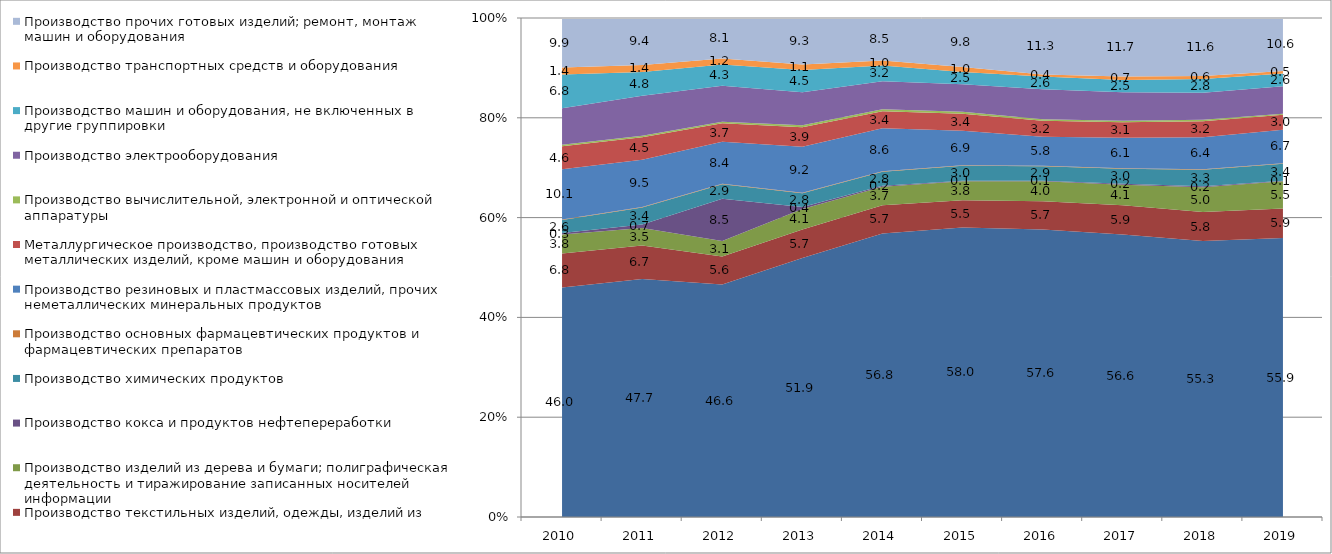
| Category | Производство продуктов питания, напитков и табачных изделий | Производство текстильных изделий, одежды, изделий из кожи и меха | Производство изделий из дерева и бумаги; полиграфическая деятельность и тиражирование записанных носителей информации | Производство кокса и продуктов нефтепереработки | Производство химических продуктов | Производство основных фармацевтических продуктов и фармацевтических препаратов | Производство резиновых и пластмассовых изделий, прочих неметаллических минеральных продуктов | Металлургическое производство, производство готовых металлических изделий, кроме машин и оборудования | Производство вычислительной, электронной и оптической аппаратуры | Производство электрооборудования | Производство машин и оборудования, не включенных в другие группировки | Производство транспортных средств и оборудования | Производство прочих готовых изделий; ремонт, монтаж машин и оборудования |
|---|---|---|---|---|---|---|---|---|---|---|---|---|---|
| 0 | 46 | 6.8 | 3.8 | 0.3 | 2.6 | 0.1 | 10.1 | 4.6 | 0.3 | 7.3 | 6.8 | 1.4 | 9.9 |
| 1 | 47.7 | 6.7 | 3.5 | 0.7 | 3.4 | 0.1 | 9.5 | 4.5 | 0.3 | 8 | 4.8 | 1.4 | 9.4 |
| 2 | 46.6 | 5.6 | 3.1 | 8.5 | 2.9 | 0.1 | 8.4 | 3.7 | 0.3 | 7.2 | 4.3 | 1.2 | 8.1 |
| 3 | 51.9 | 5.7 | 4.1 | 0.4 | 2.8 | 0.1 | 9.2 | 3.9 | 0.4 | 6.6 | 4.5 | 1.1 | 9.3 |
| 4 | 56.8 | 5.7 | 3.7 | 0.2 | 2.8 | 0.1 | 8.6 | 3.4 | 0.4 | 5.6 | 3.2 | 1 | 8.5 |
| 5 | 58 | 5.5 | 3.8 | 0.1 | 3 | 0.1 | 6.9 | 3.4 | 0.4 | 5.5 | 2.5 | 1 | 9.8 |
| 6 | 57.6 | 5.7 | 4 | 0.1 | 2.9 | 0.1 | 5.8 | 3.2 | 0.3 | 6 | 2.6 | 0.4 | 11.3 |
| 7 | 56.6 | 5.9 | 4.1 | 0.2 | 3 | 0.1 | 6.1 | 3.1 | 0.3 | 5.7 | 2.5 | 0.7 | 11.7 |
| 8 | 55.3 | 5.8 | 5 | 0.2 | 3.3 | 0.1 | 6.4 | 3.2 | 0.3 | 5.4 | 2.8 | 0.6 | 11.6 |
| 9 | 55.9 | 5.9 | 5.5 | 0.1 | 3.4 | 0.1 | 6.7 | 3 | 0.2 | 5.5 | 2.6 | 0.5 | 10.6 |